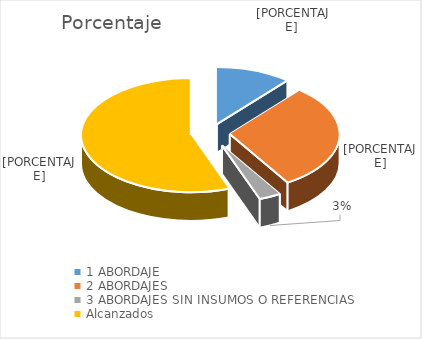
| Category | Porcentaje |
|---|---|
| 1 ABORDAJE  | 0.111 |
| 2 ABORDAJES | 0.301 |
| 3 ABORDAJES SIN INSUMOS O REFERENCIAS | 0.032 |
| Alcanzados | 0.556 |